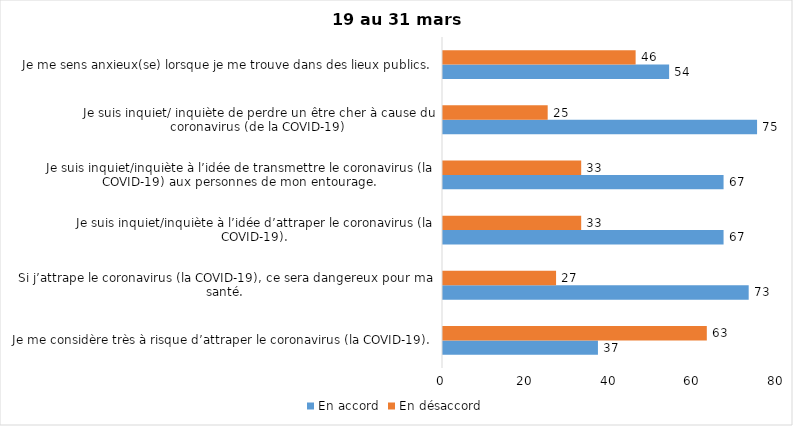
| Category | En accord | En désaccord |
|---|---|---|
| Je me considère très à risque d’attraper le coronavirus (la COVID-19). | 37 | 63 |
| Si j’attrape le coronavirus (la COVID-19), ce sera dangereux pour ma santé. | 73 | 27 |
| Je suis inquiet/inquiète à l’idée d’attraper le coronavirus (la COVID-19). | 67 | 33 |
| Je suis inquiet/inquiète à l’idée de transmettre le coronavirus (la COVID-19) aux personnes de mon entourage. | 67 | 33 |
| Je suis inquiet/ inquiète de perdre un être cher à cause du coronavirus (de la COVID-19) | 75 | 25 |
| Je me sens anxieux(se) lorsque je me trouve dans des lieux publics. | 54 | 46 |